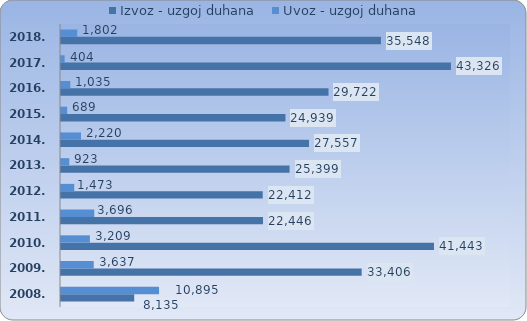
| Category | Izvoz - uzgoj duhana | Uvoz - uzgoj duhana |
|---|---|---|
| 2008.  | 8135.055 | 10894.822 |
| 2009.  | 33405.765 | 3636.873 |
| 2010.  | 41443.15 | 3209.398 |
| 2011.  | 22445.596 | 3695.844 |
| 2012.  | 22411.568 | 1472.885 |
| 2013.  | 25399.097 | 923.004 |
| 2014.  | 27557.168 | 2219.763 |
| 2015.  | 24938.874 | 689.26 |
| 2016.  | 29721.975 | 1035.008 |
| 2017. | 43325.641 | 403.634 |
| 2018. | 35548.165 | 1802.349 |